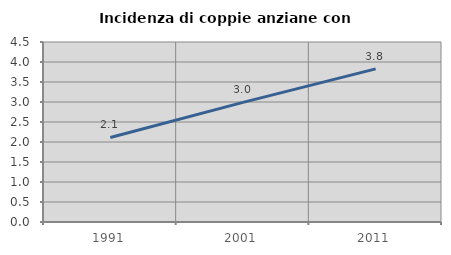
| Category | Incidenza di coppie anziane con figli |
|---|---|
| 1991.0 | 2.114 |
| 2001.0 | 2.99 |
| 2011.0 | 3.828 |